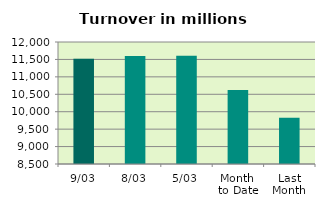
| Category | Series 0 |
|---|---|
| 9/03 | 11522.863 |
| 8/03 | 11598.25 |
| 5/03 | 11608.111 |
| Month 
to Date | 10620.635 |
| Last
Month | 9824.278 |